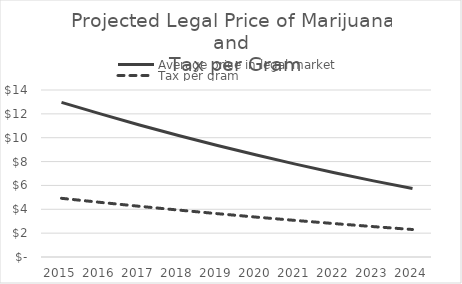
| Category | Average price in legal market | Tax per gram |
|---|---|---|
| 2015.0 | 12.968 | 4.92 |
| 2016.0 | 11.997 | 4.578 |
| 2017.0 | 11.07 | 4.25 |
| 2018.0 | 10.187 | 3.934 |
| 2019.0 | 9.346 | 3.632 |
| 2020.0 | 8.546 | 3.342 |
| 2021.0 | 7.786 | 3.065 |
| 2022.0 | 7.065 | 2.8 |
| 2023.0 | 6.382 | 2.546 |
| 2024.0 | 5.736 | 2.304 |